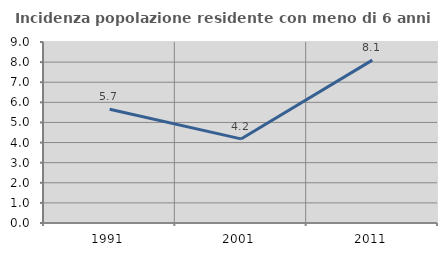
| Category | Incidenza popolazione residente con meno di 6 anni |
|---|---|
| 1991.0 | 5.66 |
| 2001.0 | 4.181 |
| 2011.0 | 8.1 |